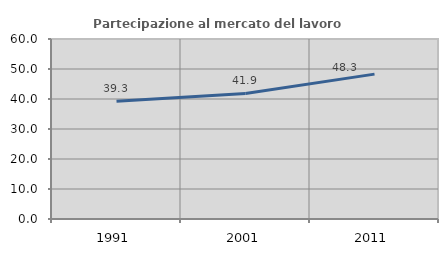
| Category | Partecipazione al mercato del lavoro  femminile |
|---|---|
| 1991.0 | 39.255 |
| 2001.0 | 41.867 |
| 2011.0 | 48.29 |